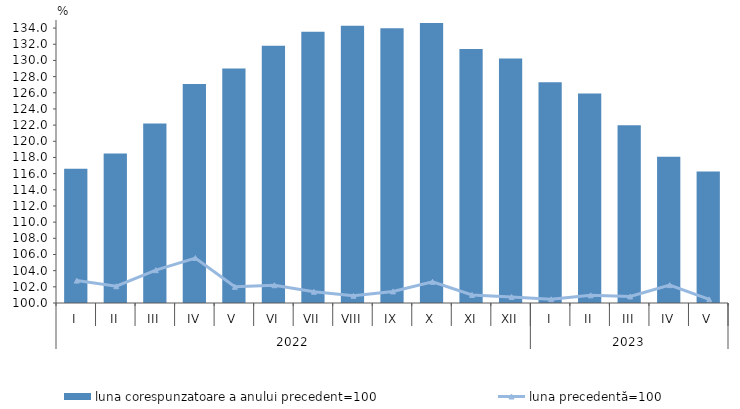
| Category | luna corespunzatoare a anului precedent=100 |
|---|---|
| 0 | 116.6 |
| 1 | 118.5 |
| 2 | 122.2 |
| 3 | 127.1 |
| 4 | 129 |
| 5 | 131.8 |
| 6 | 133.55 |
| 7 | 134.29 |
| 8 | 133.97 |
| 9 | 134.62 |
| 10 | 131.4 |
| 11 | 130.24 |
| 12 | 127.307 |
| 13 | 125.905 |
| 14 | 121.977 |
| 15 | 118.102 |
| 16 | 116.262 |